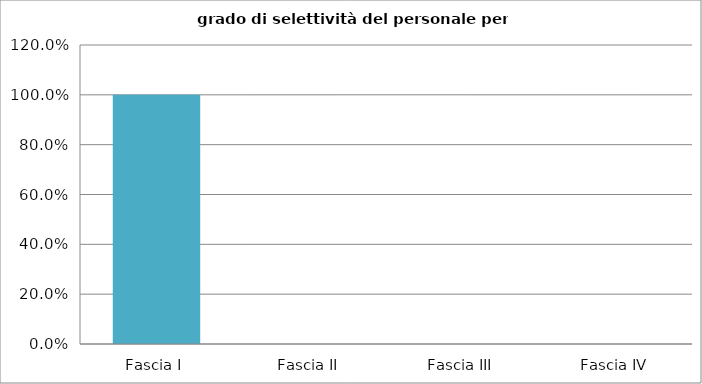
| Category | Totale ente |
|---|---|
| Fascia I | 1 |
| Fascia II | 0 |
| Fascia III | 0 |
| Fascia IV | 0 |